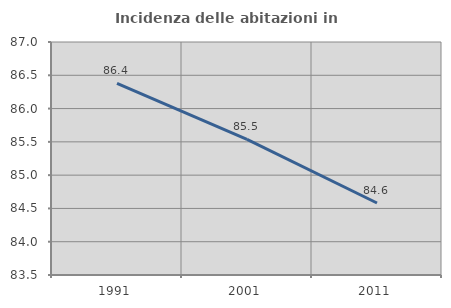
| Category | Incidenza delle abitazioni in proprietà  |
|---|---|
| 1991.0 | 86.378 |
| 2001.0 | 85.536 |
| 2011.0 | 84.581 |